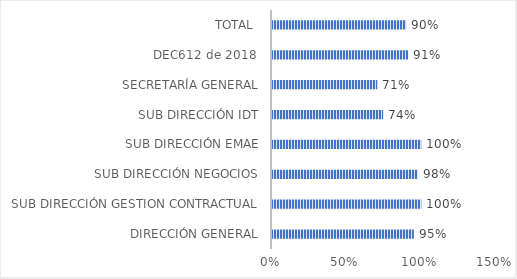
| Category | PORCENTAJE DE CUMPLIMIENTO Q4 |
|---|---|
| DIRECCIÓN GENERAL | 0.95 |
| SUB DIRECCIÓN GESTION CONTRACTUAL | 1 |
| SUB DIRECCIÓN NEGOCIOS | 0.975 |
| SUB DIRECCIÓN EMAE | 1 |
| SUB DIRECCIÓN IDT | 0.744 |
| SECRETARÍA GENERAL | 0.705 |
| DEC612 de 2018  | 0.913 |
| TOTAL  | 0.898 |